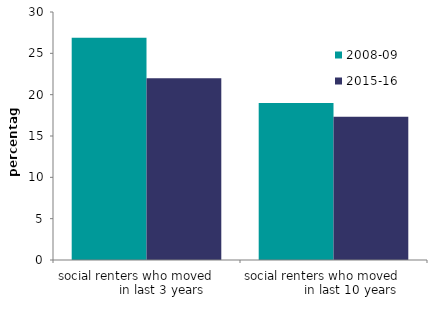
| Category | 2008-09 | 2015-16 |
|---|---|---|
|  social renters who moved               in last 3 years | 26.894 | 21.992 |
|  social renters who moved                in last 10 years | 19 | 17.341 |